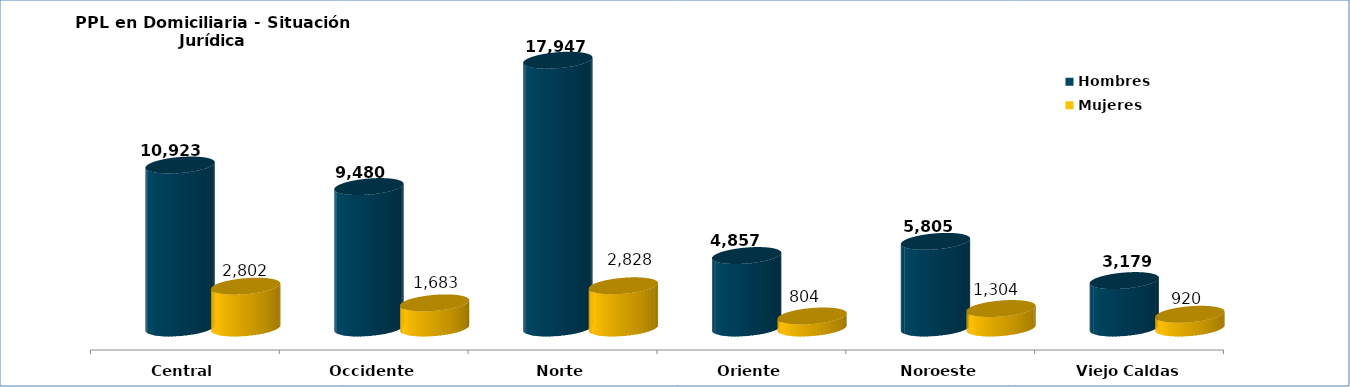
| Category | Hombres | Mujeres |
|---|---|---|
| Central | 10923 | 2802 |
| Occidente | 9480 | 1683 |
| Norte | 17947 | 2828 |
| Oriente | 4857 | 804 |
| Noroeste | 5805 | 1304 |
| Viejo Caldas | 3179 | 920 |